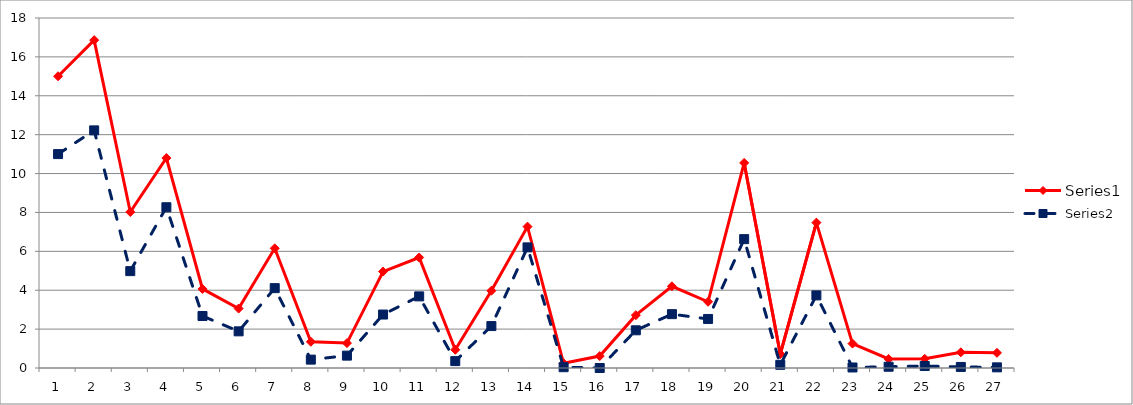
| Category | Series 0 | Series 1 |
|---|---|---|
| 0 | 15.003 | 11.001 |
| 1 | 16.862 | 12.22 |
| 2 | 8.022 | 4.983 |
| 3 | 10.799 | 8.267 |
| 4 | 4.066 | 2.674 |
| 5 | 3.057 | 1.886 |
| 6 | 6.155 | 4.107 |
| 7 | 1.348 | 0.431 |
| 8 | 1.281 | 0.636 |
| 9 | 4.959 | 2.749 |
| 10 | 5.683 | 3.683 |
| 11 | 0.938 | 0.355 |
| 12 | 3.974 | 2.156 |
| 13 | 7.27 | 6.203 |
| 14 | 0.244 | 0.041 |
| 15 | 0.616 | 0 |
| 16 | 2.716 | 1.939 |
| 17 | 4.202 | 2.77 |
| 18 | 3.405 | 2.522 |
| 19 | 10.547 | 6.628 |
| 20 | 0.719 | 0.164 |
| 21 | 7.476 | 3.734 |
| 22 | 1.256 | 0.027 |
| 23 | 0.464 | 0.065 |
| 24 | 0.472 | 0.104 |
| 25 | 0.807 | 0.055 |
| 26 | 0.78 | 0.034 |